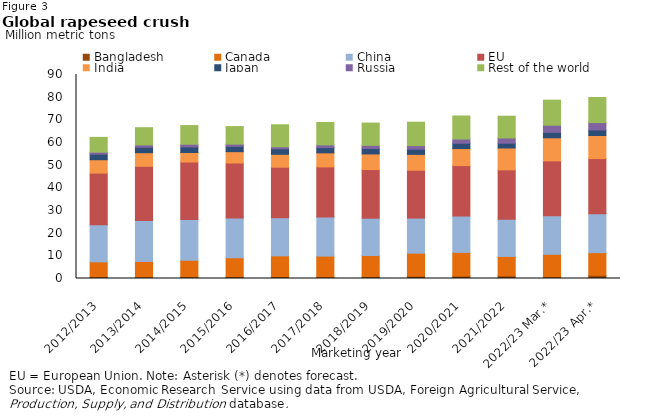
| Category | Bangladesh | Canada | China | EU | India | Japan | Russia | Rest of the world |
|---|---|---|---|---|---|---|---|---|
| 2012/2013 | 0.63 | 6.717 | 16.4 | 22.75 | 5.9 | 2.438 | 0.9 | 6.524 |
| 2013/2014 | 0.56 | 6.979 | 18 | 23.95 | 6 | 2.4 | 1.05 | 7.597 |
| 2014/2015 | 0.68 | 7.36 | 18 | 25.35 | 4.2 | 2.473 | 1.18 | 8.229 |
| 2015/2016 | 0.834 | 8.315 | 17.5 | 24.3 | 5 | 2.352 | 0.99 | 7.728 |
| 2016/2017 | 0.815 | 9.191 | 16.8 | 22.3 | 5.7 | 2.4 | 0.9 | 9.719 |
| 2017/2018 | 0.615 | 9.269 | 17.3 | 22.05 | 6.2 | 2.315 | 1.2 | 9.881 |
| 2018/2019 | 0.835 | 9.295 | 16.475 | 21.45 | 6.9 | 2.397 | 1.4 | 9.83 |
| 2019/2020 | 1.05 | 10.129 | 15.485 | 21.1 | 7 | 2.269 | 1.6 | 10.326 |
| 2020/2021 | 1.1 | 10.425 | 16 | 22.3 | 7.5 | 2.355 | 1.85 | 10.168 |
| 2021/2022 | 1.175 | 8.555 | 16.4 | 21.8 | 9.65 | 2.119 | 2.3 | 9.608 |
| 2022/23 Mar.* | 0.68 | 10 | 17 | 24.2 | 10.2 | 2.4 | 3.15 | 11.052 |
| 2022/23 Apr.* | 1.4 | 10 | 17.2 | 24.3 | 10.2 | 2.442 | 3.25 | 11.054 |